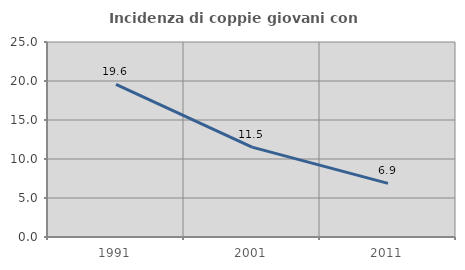
| Category | Incidenza di coppie giovani con figli |
|---|---|
| 1991.0 | 19.554 |
| 2001.0 | 11.523 |
| 2011.0 | 6.871 |